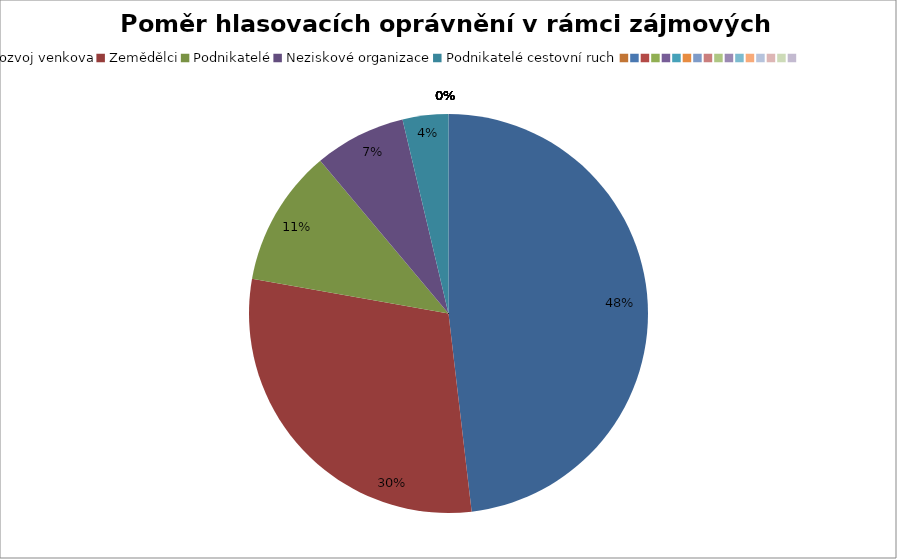
| Category | Series 0 |
|---|---|
| Rozvoj venkova | 0.481 |
| Zemědělci | 0.296 |
| Podnikatelé | 0.111 |
| Neziskové organizace | 0.074 |
| Podnikatelé cestovní ruch | 0.037 |